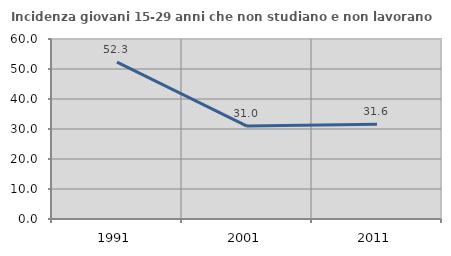
| Category | Incidenza giovani 15-29 anni che non studiano e non lavorano  |
|---|---|
| 1991.0 | 52.312 |
| 2001.0 | 30.959 |
| 2011.0 | 31.595 |